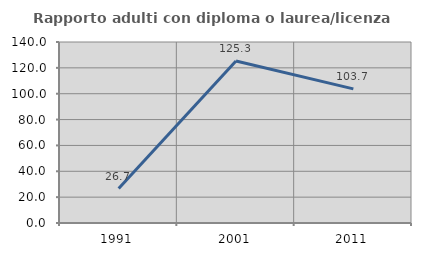
| Category | Rapporto adulti con diploma o laurea/licenza media  |
|---|---|
| 1991.0 | 26.667 |
| 2001.0 | 125.316 |
| 2011.0 | 103.738 |